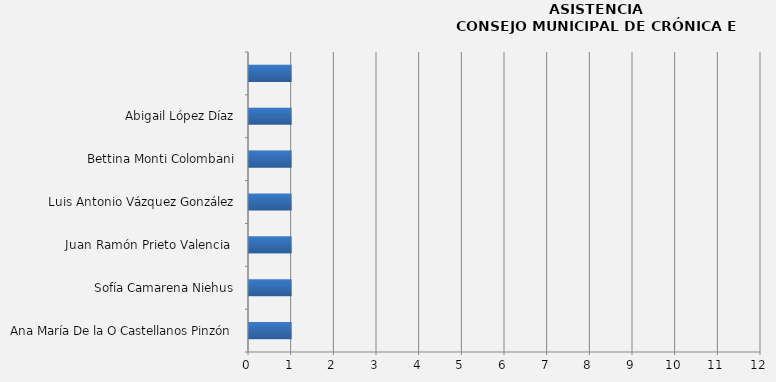
| Category | Series 0 |
|---|---|
| Ana María De la O Castellanos Pinzón | 1 |
| Sofía Camarena Niehus | 1 |
| Juan Ramón Prieto Valencia  | 1 |
| Luis Antonio Vázquez González | 1 |
| Bettina Monti Colombani | 1 |
| Abigail López Díaz | 1 |